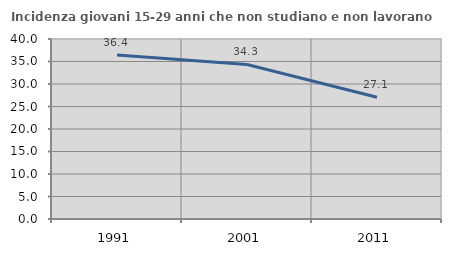
| Category | Incidenza giovani 15-29 anni che non studiano e non lavorano  |
|---|---|
| 1991.0 | 36.441 |
| 2001.0 | 34.345 |
| 2011.0 | 27.072 |